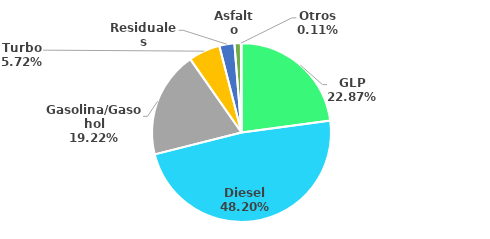
| Category | MBPD |
|---|---|
| GLP | 64.662 |
| Diesel | 136.26 |
| Gasolina/Gasohol | 54.339 |
| Turbo | 16.157 |
| Residuales | 7.692 |
| Asfalto | 3.293 |
| Otros | 0.299 |